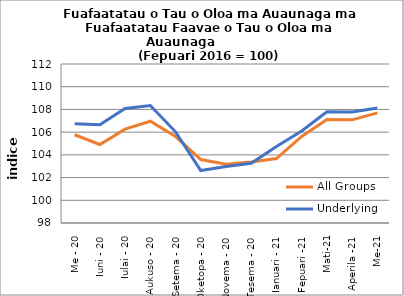
| Category | All Groups | Underlying |
|---|---|---|
| Me - 20 | 105.77 | 106.735 |
| Iuni - 20 | 104.913 | 106.661 |
| Iulai - 20 | 106.265 | 108.077 |
| Aukuso - 20 | 106.963 | 108.349 |
| Setema - 20 | 105.614 | 106.027 |
| Oketopa - 20 | 103.588 | 102.619 |
| Novema - 20 | 103.171 | 102.969 |
| Tesema - 20 | 103.378 | 103.266 |
| Ianuari - 21 | 103.671 | 104.733 |
| Fepuari -21 | 105.627 | 106.099 |
| Mati-21 | 107.11 | 107.788 |
| Aperila -21 | 107.082 | 107.772 |
| Me-21 | 107.693 | 108.128 |